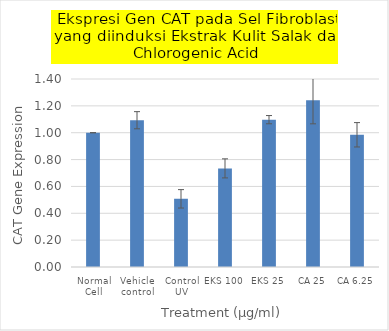
| Category | Series 0 |
|---|---|
| Normal Cell | 1 |
| Vehicle control | 1.093 |
| Control UV | 0.508 |
| EKS 100 | 0.734 |
| EKS 25 | 1.097 |
| CA 25 | 1.242 |
| CA 6.25 | 0.985 |